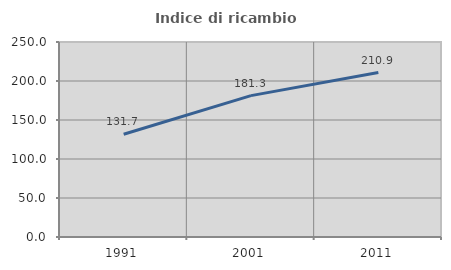
| Category | Indice di ricambio occupazionale  |
|---|---|
| 1991.0 | 131.737 |
| 2001.0 | 181.25 |
| 2011.0 | 210.87 |